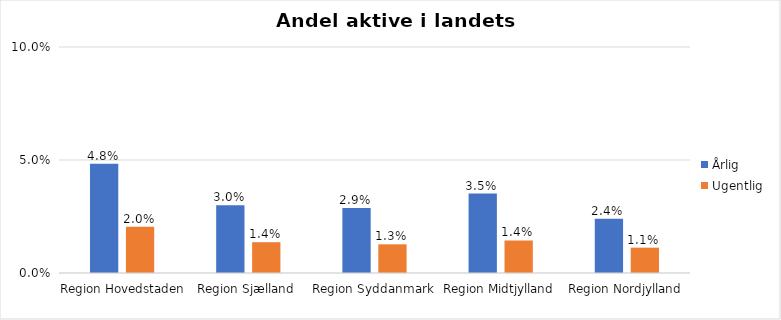
| Category | Årlig | Ugentlig |
|---|---|---|
| Region Hovedstaden | 0.048 | 0.02 |
| Region Sjælland | 0.03 | 0.014 |
| Region Syddanmark | 0.029 | 0.013 |
| Region Midtjylland | 0.035 | 0.014 |
| Region Nordjylland | 0.024 | 0.011 |